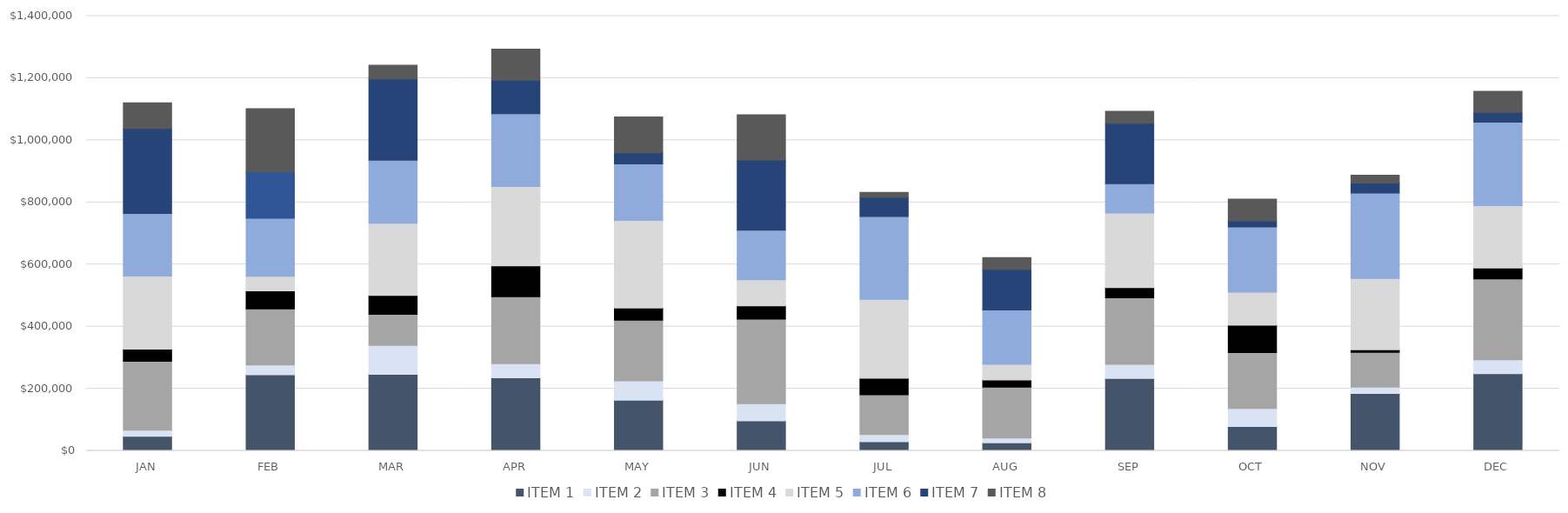
| Category | ITEM 1 | ITEM 2 | ITEM 3 | ITEM 4 | ITEM 5 | ITEM 6 | ITEM 7 | ITEM 8 |
|---|---|---|---|---|---|---|---|---|
| JAN | 47216 | 19193 | 222006 | 39469 | 234770 | 201494 | 274110 | 82171 |
| FEB | 244714 | 32086 | 180009 | 58661 | 46607 | 186911 | 149012 | 204047 |
| MAR | 246549 | 93117 | 99998 | 60612 | 232313 | 203515 | 260774 | 44710 |
| APR | 235062 | 45862 | 215030 | 99456 | 255979 | 234445 | 107794 | 100217 |
| MAY | 162881 | 62853 | 195262 | 39062 | 282279 | 181894 | 35721 | 115395 |
| JUN | 96528 | 55513 | 272260 | 42689 | 83677 | 160175 | 225425 | 145751 |
| JUL | 29235 | 22945 | 128123 | 53197 | 254593 | 266340 | 62085 | 15786 |
| AUG | 25934 | 15084 | 163950 | 23026 | 50461 | 175055 | 130874 | 37944 |
| SEP | 233397 | 45347 | 213914 | 33165 | 239685 | 94469 | 194695 | 38415 |
| OCT | 78479 | 57736 | 180191 | 88342 | 106425 | 209779 | 19447 | 70395 |
| NOV | 184799 | 20142 | 111890 | 8492 | 229535 | 275541 | 31889 | 25040 |
| DEC | 248215 | 45284 | 260495 | 34798 | 200682 | 268761 | 31930 | 67508 |